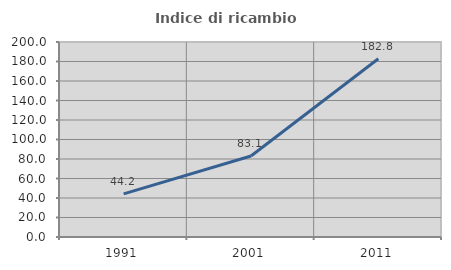
| Category | Indice di ricambio occupazionale  |
|---|---|
| 1991.0 | 44.186 |
| 2001.0 | 83.088 |
| 2011.0 | 182.812 |